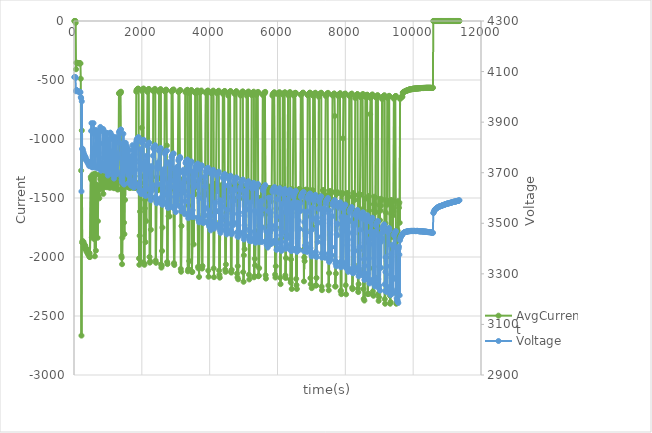
| Category | AvgCurrent |
|---|---|
| 10.017 | 0 |
| 20.016 | 0 |
| 30.027 | 0 |
| 40.04 | 0 |
| 50.044 | -16 |
| 60.05 | -409 |
| 70.051 | -353 |
| 80.059 | -355 |
| 90.064 | -355 |
| 100.068 | -356 |
| 110.075 | -355 |
| 120.085 | -357 |
| 130.099 | -357 |
| 140.11 | -358 |
| 150.125 | -357 |
| 160.14 | -358 |
| 170.144 | -358 |
| 180.146 | -358 |
| 190.158 | -360 |
| 200.16 | -489 |
| 210.163 | -1268 |
| 220.165 | -2666 |
| 230.172 | -928 |
| 240.173 | -1878 |
| 250.185 | -1864 |
| 260.198 | -1882 |
| 270.2 | -1885 |
| 280.215 | -1871 |
| 290.224 | -1915 |
| 300.235 | -1890 |
| 310.247 | -1897 |
| 320.252 | -1927 |
| 330.264 | -1904 |
| 340.28 | -1937 |
| 350.291 | -1934 |
| 360.341 | -1926 |
| 370.317 | -1955 |
| 380.371 | -1938 |
| 390.324 | -1951 |
| 400.357 | -1969 |
| 410.344 | -1946 |
| 420.403 | -1980 |
| 430.361 | -1963 |
| 440.449 | -1963 |
| 450.368 | -1998 |
| 460.466 | -1969 |
| 470.378 | -2001 |
| 495.441 | -1321 |
| 505.019 | -1339 |
| 515.442 | -1341 |
| 525.031 | -1834 |
| 535.54 | -1349 |
| 545.044 | -1301 |
| 555.615 | -1314 |
| 565.059 | -1406 |
| 575.64 | -1438 |
| 585.064 | -1391 |
| 595.638 | -1849 |
| 605.093 | -1294 |
| 615.667 | -1994 |
| 625.121 | -1311 |
| 635.792 | -1297 |
| 645.14 | -1946 |
| 655.758 | -1402 |
| 665.156 | -1386 |
| 675.81 | -1393 |
| 685.18 | -1395 |
| 695.843 | -1837 |
| 705.203 | -1696 |
| 715.944 | -1403 |
| 725.214 | -1488 |
| 735.967 | -1403 |
| 745.235 | -1503 |
| 755.951 | -1303 |
| 765.255 | -1305 |
| 776.014 | -1342 |
| 785.271 | -1330 |
| 796.061 | -1396 |
| 805.285 | -1306 |
| 816.098 | -1427 |
| 825.312 | -1366 |
| 836.162 | -1358 |
| 845.323 | -1309 |
| 856.166 | -1358 |
| 865.339 | -1465 |
| 876.263 | -1380 |
| 885.356 | -1404 |
| 896.34 | -1402 |
| 905.374 | -1309 |
| 916.323 | -1408 |
| 925.382 | -1303 |
| 936.388 | -1375 |
| 945.405 | -1341 |
| 956.452 | -1310 |
| 965.426 | -1315 |
| 976.5 | -1409 |
| 985.443 | -1319 |
| 996.559 | -1385 |
| 1005.459 | -1348 |
| 1016.667 | -1318 |
| 1025.48 | -1309 |
| 1036.616 | -1314 |
| 1045.496 | -1413 |
| 1056.575 | -1409 |
| 1065.514 | -1345 |
| 1076.638 | -1346 |
| 1085.527 | -1317 |
| 1096.682 | -1411 |
| 1105.551 | -1357 |
| 1116.699 | -1365 |
| 1125.577 | -1339 |
| 1136.738 | -1379 |
| 1145.588 | -1399 |
| 1156.798 | -1320 |
| 1165.602 | -1314 |
| 1176.794 | -1417 |
| 1185.617 | -1361 |
| 1196.876 | -1406 |
| 1205.626 | -1321 |
| 1216.903 | -1318 |
| 1225.639 | -1360 |
| 1236.967 | -1410 |
| 1245.665 | -1342 |
| 1256.998 | -1324 |
| 1265.672 | -1384 |
| 1277.018 | -1427 |
| 1285.7 | -1321 |
| 1297.073 | -1326 |
| 1305.728 | -1427 |
| 1317.105 | -1006 |
| 1325.74 | -614 |
| 1337.122 | -611 |
| 1345.752 | -606 |
| 1357.139 | -614 |
| 1365.777 | -605 |
| 1377.199 | -610 |
| 1385.79 | -599 |
| 1397.201 | -1991 |
| 1405.806 | -2006 |
| 1417.266 | -2061 |
| 1425.824 | -1837 |
| 1437.277 | -1313 |
| 1445.839 | -1418 |
| 1455.843 | -1291 |
| 1465.844 | -1395 |
| 1475.847 | -1709 |
| 1485.85 | -1806 |
| 1495.854 | -1373 |
| 1505.858 | -1516 |
| 1515.87 | -1303 |
| 1525.884 | -1345 |
| 1535.889 | -1298 |
| 1545.894 | -1384 |
| 1555.907 | -1401 |
| 1565.92 | -1301 |
| 1575.932 | -1304 |
| 1585.932 | -1408 |
| 1595.941 | -1373 |
| 1605.952 | -1306 |
| 1615.966 | -1408 |
| 1625.979 | -1407 |
| 1635.986 | -1392 |
| 1645.998 | -1416 |
| 1656.004 | -1365 |
| 1666.011 | -1304 |
| 1676.021 | -1407 |
| 1686.022 | -1333 |
| 1696.029 | -1411 |
| 1706.029 | -1403 |
| 1716.042 | -1309 |
| 1726.048 | -1330 |
| 1736.049 | -1402 |
| 1746.052 | -1414 |
| 1756.055 | -1380 |
| 1766.067 | -1315 |
| 1776.08 | -1315 |
| 1786.091 | -1315 |
| 1796.094 | -1361 |
| 1806.096 | -1414 |
| 1816.106 | -1414 |
| 1826.121 | -1372 |
| 1836.121 | -599 |
| 1846.123 | -586 |
| 1856.126 | -588 |
| 1866.137 | -578 |
| 1876.152 | -581 |
| 1886.159 | -574 |
| 1896.173 | -574 |
| 1906.202 | -576 |
| 1916.183 | -2012 |
| 1926.222 | -2066 |
| 1936.201 | -1820 |
| 1946.233 | -1615 |
| 1956.212 | -1411 |
| 1966.264 | -1373 |
| 1976.231 | -2042 |
| 1986.311 | -1316 |
| 1996.247 | -905 |
| 2006.357 | -595 |
| 2016.253 | -583 |
| 2026.42 | -578 |
| 2036.273 | -581 |
| 2046.465 | -573 |
| 2056.298 | -574 |
| 2066.514 | -2052 |
| 2076.313 | -2066 |
| 2086.592 | -1587 |
| 2096.335 | -1516 |
| 2106.608 | -1874 |
| 2116.353 | -1318 |
| 2126.575 | -1696 |
| 2136.378 | -1455 |
| 2146.672 | -1322 |
| 2156.397 | -1319 |
| 2166.687 | -601 |
| 2176.412 | -586 |
| 2186.733 | -587 |
| 2196.43 | -579 |
| 2206.83 | -576 |
| 2216.441 | -580 |
| 2226.859 | -1999 |
| 2236.454 | -2048 |
| 2246.89 | -2036 |
| 2256.462 | -1318 |
| 2266.873 | -1769 |
| 2276.481 | -1321 |
| 2286.953 | -1389 |
| 2296.493 | -1496 |
| 2306.981 | -1323 |
| 2316.502 | -1421 |
| 2326.995 | -1389 |
| 2336.517 | -593 |
| 2347.092 | -596 |
| 2356.543 | -586 |
| 2367.062 | -583 |
| 2376.565 | -584 |
| 2387.168 | -575 |
| 2396.58 | -583 |
| 2407.17 | -2030 |
| 2416.585 | -2049 |
| 2427.184 | -1531 |
| 2436.607 | -1508 |
| 2447.247 | -1437 |
| 2456.632 | -1432 |
| 2467.264 | -1328 |
| 2476.645 | -1434 |
| 2487.309 | -1419 |
| 2496.665 | -1332 |
| 2507.373 | -602 |
| 2516.689 | -590 |
| 2527.388 | -597 |
| 2536.714 | -582 |
| 2547.451 | -586 |
| 2556.725 | -577 |
| 2567.498 | -2063 |
| 2576.743 | -2090 |
| 2587.528 | -2074 |
| 2596.769 | -1949 |
| 2607.574 | -1750 |
| 2616.787 | -1441 |
| 2627.65 | -1332 |
| 2636.808 | -1333 |
| 2647.698 | -1411 |
| 2656.822 | -1341 |
| 2667.683 | -1098 |
| 2676.841 | -597 |
| 2687.712 | -595 |
| 2696.852 | -587 |
| 2707.76 | -590 |
| 2716.857 | -581 |
| 2727.807 | -587 |
| 2736.873 | -1055 |
| 2747.825 | -2042 |
| 2756.889 | -2060 |
| 2767.87 | -1482 |
| 2776.895 | -1412 |
| 2787.901 | -1654 |
| 2796.909 | -1339 |
| 2807.933 | -1387 |
| 2816.922 | -1656 |
| 2827.947 | -1414 |
| 2836.93 | -1341 |
| 2848.012 | -1344 |
| 2856.945 | -1340 |
| 2868.043 | -1346 |
| 2876.956 | -598 |
| 2888.089 | -593 |
| 2896.974 | -590 |
| 2908.124 | -586 |
| 2916.991 | -584 |
| 2928.154 | -585 |
| 2937.007 | -580 |
| 2948.186 | -2051 |
| 2957.029 | -2068 |
| 2968.245 | -1426 |
| 2977.056 | -1424 |
| 2988.282 | -1442 |
| 2997.071 | -1556 |
| 3008.327 | -1455 |
| 3017.085 | -1449 |
| 3028.375 | -1350 |
| 3037.114 | -1418 |
| 3048.39 | -1466 |
| 3057.14 | -1347 |
| 3068.434 | -1350 |
| 3077.152 | -602 |
| 3088.465 | -600 |
| 3097.172 | -594 |
| 3108.498 | -593 |
| 3117.19 | -588 |
| 3128.512 | -587 |
| 3137.204 | -586 |
| 3148.529 | -2101 |
| 3157.217 | -2125 |
| 3168.608 | -1737 |
| 3177.233 | -1343 |
| 3188.671 | -1372 |
| 3197.242 | -1397 |
| 3207.242 | -1429 |
| 3217.247 | -1453 |
| 3227.261 | -1369 |
| 3237.262 | -1434 |
| 3247.275 | -1351 |
| 3257.289 | -1350 |
| 3267.297 | -1363 |
| 3277.298 | -1359 |
| 3287.308 | -605 |
| 3297.323 | -597 |
| 3307.326 | -594 |
| 3317.34 | -590 |
| 3327.343 | -587 |
| 3337.351 | -592 |
| 3347.352 | -583 |
| 3357.357 | -2121 |
| 3367.369 | -2104 |
| 3377.378 | -1564 |
| 3387.383 | -2105 |
| 3397.389 | -2034 |
| 3407.404 | -612 |
| 3417.407 | -600 |
| 3427.408 | -605 |
| 3437.421 | -592 |
| 3447.431 | -593 |
| 3457.436 | -586 |
| 3467.436 | -587 |
| 3477.45 | -2126 |
| 3487.453 | -2127 |
| 3497.469 | -1673 |
| 3507.47 | -1404 |
| 3517.487 | -1357 |
| 3527.493 | -1893 |
| 3537.504 | -1372 |
| 3547.519 | -1359 |
| 3557.532 | -1414 |
| 3567.545 | -1468 |
| 3577.555 | -610 |
| 3587.561 | -609 |
| 3597.571 | -598 |
| 3607.579 | -600 |
| 3617.588 | -593 |
| 3627.599 | -600 |
| 3637.604 | -588 |
| 3647.608 | -595 |
| 3657.614 | -2083 |
| 3667.614 | -2097 |
| 3677.624 | -1666 |
| 3687.635 | -2169 |
| 3697.675 | -1678 |
| 3707.649 | -606 |
| 3717.654 | -604 |
| 3727.669 | -600 |
| 3737.674 | -594 |
| 3747.68 | -599 |
| 3757.714 | -589 |
| 3767.704 | -1327 |
| 3777.778 | -2098 |
| 3787.725 | -2076 |
| 3797.797 | -1684 |
| 3807.744 | -1464 |
| 3817.825 | -1639 |
| 3827.759 | -1448 |
| 3837.873 | -1461 |
| 3847.771 | -1407 |
| 3857.916 | -1369 |
| 3867.789 | -1474 |
| 3877.947 | -1468 |
| 3887.805 | -606 |
| 3897.981 | -612 |
| 3907.823 | -599 |
| 3918.042 | -597 |
| 3927.851 | -594 |
| 3938.057 | -597 |
| 3947.869 | -589 |
| 3958.075 | -2115 |
| 3967.88 | -2167 |
| 3978.12 | -1473 |
| 3987.899 | -1434 |
| 3998.135 | -1692 |
| 4007.914 | -1403 |
| 4018.183 | -1625 |
| 4027.939 | -1527 |
| 4038.198 | -1423 |
| 4047.956 | -611 |
| 4058.231 | -609 |
| 4067.972 | -601 |
| 4078.264 | -605 |
| 4087.986 | -596 |
| 4098.296 | -599 |
| 4107.992 | -590 |
| 4118.344 | -2096 |
| 4128.008 | -2171 |
| 4138.385 | -1694 |
| 4148.038 | -1698 |
| 4158.418 | -1382 |
| 4168.049 | -1610 |
| 4178.434 | -1612 |
| 4188.059 | -1379 |
| 4198.479 | -1378 |
| 4208.064 | -611 |
| 4218.497 | -605 |
| 4228.082 | -603 |
| 4238.541 | -598 |
| 4248.095 | -597 |
| 4258.577 | -604 |
| 4268.112 | -591 |
| 4278.627 | -2115 |
| 4288.14 | -2150 |
| 4298.65 | -2175 |
| 4308.167 | -1752 |
| 4318.684 | -1626 |
| 4328.19 | -1486 |
| 4338.745 | -1432 |
| 4348.218 | -1491 |
| 4358.806 | -1395 |
| 4368.22 | -1450 |
| 4378.84 | -1384 |
| 4388.227 | -617 |
| 4398.823 | -607 |
| 4408.251 | -605 |
| 4418.853 | -602 |
| 4428.261 | -598 |
| 4438.884 | -596 |
| 4448.273 | -593 |
| 4458.935 | -2106 |
| 4468.292 | -2126 |
| 4478.982 | -2063 |
| 4488.307 | -1661 |
| 4499.029 | -1631 |
| 4508.308 | -1606 |
| 4519.073 | -1451 |
| 4528.323 | -1496 |
| 4539.105 | -1421 |
| 4548.338 | -633 |
| 4559.166 | -611 |
| 4568.355 | -608 |
| 4579.169 | -604 |
| 4588.376 | -603 |
| 4599.215 | -599 |
| 4608.38 | -596 |
| 4619.259 | -594 |
| 4628.381 | -2125 |
| 4639.277 | -2132 |
| 4648.386 | -2108 |
| 4659.322 | -1489 |
| 4668.398 | -1719 |
| 4679.341 | -1434 |
| 4688.421 | -1392 |
| 4699.402 | -1391 |
| 4708.432 | -1501 |
| 4719.419 | -1419 |
| 4728.46 | -614 |
| 4739.449 | -610 |
| 4748.485 | -620 |
| 4759.526 | -604 |
| 4768.492 | -604 |
| 4779.512 | -597 |
| 4788.498 | -595 |
| 4799.573 | -602 |
| 4808.505 | -2140 |
| 4819.575 | -2173 |
| 4828.519 | -2077 |
| 4839.62 | -2189 |
| 4848.538 | -1392 |
| 4859.667 | -1496 |
| 4868.55 | -1392 |
| 4879.699 | -1462 |
| 4888.56 | -1504 |
| 4899.716 | -1448 |
| 4908.585 | -631 |
| 4919.777 | -628 |
| 4928.598 | -620 |
| 4939.825 | -607 |
| 4948.616 | -611 |
| 4959.902 | -601 |
| 4968.626 | -599 |
| 4979.917 | -597 |
| 4988.641 | -2128 |
| 4999.902 | -2210 |
| 5008.653 | -1985 |
| 5020.045 | -1400 |
| 5028.659 | -1934 |
| 5040.074 | -1428 |
| 5048.675 | -1399 |
| 5060.107 | -1404 |
| 5068.691 | -1512 |
| 5078.703 | -1457 |
| 5088.713 | -632 |
| 5098.723 | -612 |
| 5108.724 | -616 |
| 5118.731 | -605 |
| 5128.733 | -605 |
| 5138.742 | -600 |
| 5148.753 | -598 |
| 5158.763 | -2150 |
| 5168.776 | -2190 |
| 5178.782 | -1840 |
| 5188.794 | -1848 |
| 5198.805 | -1404 |
| 5208.81 | -1484 |
| 5218.823 | -1519 |
| 5228.824 | -1403 |
| 5238.828 | -628 |
| 5248.836 | -616 |
| 5258.843 | -611 |
| 5268.856 | -617 |
| 5278.87 | -605 |
| 5288.871 | -616 |
| 5298.882 | -599 |
| 5308.896 | -2172 |
| 5318.905 | -2163 |
| 5328.907 | -2015 |
| 5338.912 | -2071 |
| 5348.919 | -1781 |
| 5358.926 | -1405 |
| 5368.94 | -623 |
| 5378.948 | -627 |
| 5388.949 | -612 |
| 5398.964 | -618 |
| 5408.972 | -606 |
| 5418.98 | -606 |
| 5428.991 | -601 |
| 5438.995 | -2163 |
| 5448.998 | -2159 |
| 5458.998 | -2094 |
| 5469.01 | -1733 |
| 5479.018 | -1737 |
| 5489.026 | -1503 |
| 5499.034 | -1498 |
| 5509.062 | -1737 |
| 5519.063 | -1404 |
| 5529.093 | -1409 |
| 5539.084 | -1414 |
| 5549.154 | -1412 |
| 5559.107 | -1631 |
| 5569.239 | -628 |
| 5579.136 | -622 |
| 5589.247 | -614 |
| 5599.147 | -615 |
| 5609.294 | -609 |
| 5619.164 | -615 |
| 5629.358 | -603 |
| 5639.168 | -601 |
| 5649.372 | -2154 |
| 5659.184 | -2183 |
| 5669.39 | -1491 |
| 5679.21 | -1632 |
| 5689.435 | -1411 |
| 5699.237 | -1489 |
| 5709.467 | -1585 |
| 5719.242 | -1576 |
| 5729.483 | -1527 |
| 5739.251 | -1477 |
| 5749.564 | -1524 |
| 5759.275 | -1416 |
| 5769.621 | -1438 |
| 5779.281 | -1442 |
| 5789.595 | -1417 |
| 5799.291 | -1528 |
| 5809.683 | -1437 |
| 5819.306 | -1451 |
| 5829.672 | -1416 |
| 5839.314 | -1421 |
| 5849.719 | -633 |
| 5859.332 | -619 |
| 5869.749 | -626 |
| 5879.351 | -615 |
| 5889.776 | -620 |
| 5899.381 | -606 |
| 5909.839 | -605 |
| 5919.384 | -609 |
| 5929.907 | -2149 |
| 5939.405 | -2174 |
| 5949.919 | -2078 |
| 5959.419 | -1854 |
| 5969.967 | -1589 |
| 5979.428 | -1415 |
| 5990.013 | -1682 |
| 5999.442 | -1444 |
| 6010.048 | -620 |
| 6019.461 | -616 |
| 6030.124 | -619 |
| 6039.471 | -609 |
| 6050.139 | -612 |
| 6059.485 | -603 |
| 6070.215 | -613 |
| 6079.501 | -2175 |
| 6090.245 | -2230 |
| 6099.519 | -1749 |
| 6110.294 | -1412 |
| 6119.53 | -1837 |
| 6130.343 | -1622 |
| 6139.54 | -1512 |
| 6150.328 | -1524 |
| 6159.555 | -624 |
| 6170.386 | -618 |
| 6179.574 | -614 |
| 6190.466 | -612 |
| 6199.591 | -609 |
| 6210.451 | -608 |
| 6219.598 | -604 |
| 6230.516 | -2155 |
| 6239.61 | -2178 |
| 6250.544 | -2009 |
| 6259.636 | -1494 |
| 6270.624 | -1440 |
| 6279.661 | -1814 |
| 6290.698 | -1474 |
| 6299.689 | -1507 |
| 6310.734 | -622 |
| 6319.699 | -631 |
| 6330.761 | -614 |
| 6339.719 | -616 |
| 6350.855 | -608 |
| 6359.722 | -606 |
| 6370.89 | -603 |
| 6379.745 | -2194 |
| 6390.949 | -2217 |
| 6399.765 | -2020 |
| 6411.001 | -1628 |
| 6419.779 | -2271 |
| 6431.076 | -1424 |
| 6439.792 | -1499 |
| 6451.048 | -1446 |
| 6459.806 | -1454 |
| 6471.137 | -631 |
| 6479.814 | -621 |
| 6491.153 | -627 |
| 6499.843 | -614 |
| 6511.203 | -623 |
| 6519.859 | -609 |
| 6531.265 | -609 |
| 6539.886 | -610 |
| 6551.311 | -2185 |
| 6559.894 | -2238 |
| 6571.28 | -2271 |
| 6579.912 | -1481 |
| 6591.342 | -1490 |
| 6599.933 | -1438 |
| 6611.386 | -1535 |
| 6619.942 | -1536 |
| 6629.952 | -1426 |
| 6639.96 | -1427 |
| 6649.975 | -1428 |
| 6659.989 | -1425 |
| 6669.991 | -1475 |
| 6679.999 | -1532 |
| 6690.006 | -628 |
| 6700.017 | -623 |
| 6710.027 | -618 |
| 6720.038 | -616 |
| 6730.052 | -613 |
| 6740.058 | -610 |
| 6750.071 | -610 |
| 6760.082 | -607 |
| 6770.094 | -1938 |
| 6780.1 | -2206 |
| 6790.102 | -2003 |
| 6800.11 | -2035 |
| 6810.118 | -1487 |
| 6820.118 | -1433 |
| 6830.126 | -1770 |
| 6840.13 | -1429 |
| 6850.131 | -1544 |
| 6860.141 | -1656 |
| 6870.154 | -1517 |
| 6880.167 | -1430 |
| 6890.17 | -629 |
| 6900.182 | -629 |
| 6910.194 | -625 |
| 6920.208 | -616 |
| 6930.216 | -617 |
| 6940.23 | -611 |
| 6950.233 | -609 |
| 6960.239 | -607 |
| 6970.243 | -2179 |
| 6980.249 | -2230 |
| 6990.254 | -1444 |
| 7000.269 | -1659 |
| 7010.271 | -2264 |
| 7020.28 | -1436 |
| 7030.28 | -1744 |
| 7040.287 | -1434 |
| 7050.295 | -632 |
| 7060.302 | -635 |
| 7070.317 | -620 |
| 7080.33 | -617 |
| 7090.33 | -614 |
| 7100.361 | -616 |
| 7110.345 | -615 |
| 7120.357 | -608 |
| 7130.371 | -2242 |
| 7140.379 | -2240 |
| 7150.385 | -2177 |
| 7160.398 | -1542 |
| 7170.408 | -1529 |
| 7180.411 | -1528 |
| 7190.415 | -1551 |
| 7200.469 | -1483 |
| 7210.429 | -1505 |
| 7220.481 | -643 |
| 7230.454 | -626 |
| 7240.543 | -622 |
| 7250.48 | -619 |
| 7260.527 | -618 |
| 7270.497 | -613 |
| 7280.591 | -611 |
| 7290.512 | -608 |
| 7300.656 | -2251 |
| 7310.54 | -2281 |
| 7320.731 | -1542 |
| 7330.558 | -1523 |
| 7340.732 | -1434 |
| 7350.567 | -1435 |
| 7360.798 | -1464 |
| 7370.587 | -1436 |
| 7380.799 | -1469 |
| 7390.598 | -1506 |
| 7400.887 | -1476 |
| 7410.601 | -1481 |
| 7420.874 | -635 |
| 7430.621 | -628 |
| 7440.966 | -629 |
| 7450.649 | -619 |
| 7460.951 | -627 |
| 7470.663 | -614 |
| 7481.016 | -616 |
| 7490.668 | -609 |
| 7501.03 | -2242 |
| 7510.691 | -2282 |
| 7521.078 | -2136 |
| 7530.712 | -1465 |
| 7541.123 | -1441 |
| 7550.728 | -1480 |
| 7561.17 | -1552 |
| 7570.744 | -1450 |
| 7581.186 | -1444 |
| 7590.768 | -1447 |
| 7601.263 | -1512 |
| 7610.783 | -1451 |
| 7621.343 | -631 |
| 7630.796 | -628 |
| 7641.372 | -631 |
| 7650.811 | -620 |
| 7661.39 | -623 |
| 7670.835 | -614 |
| 7681.438 | -617 |
| 7690.85 | -805 |
| 7701.454 | -2249 |
| 7710.87 | -2250 |
| 7721.498 | -2140 |
| 7730.885 | -1593 |
| 7741.545 | -1467 |
| 7750.908 | -1459 |
| 7761.575 | -1453 |
| 7770.937 | -1453 |
| 7781.622 | -634 |
| 7790.96 | -629 |
| 7801.673 | -624 |
| 7810.975 | -623 |
| 7821.746 | -619 |
| 7830.989 | -617 |
| 7841.81 | -615 |
| 7851.01 | -612 |
| 7861.81 | -2291 |
| 7871.031 | -2285 |
| 7881.889 | -2315 |
| 7891.047 | -1461 |
| 7901.889 | -1471 |
| 7911.058 | -1546 |
| 7921.938 | -1458 |
| 7931.076 | -994 |
| 7941.987 | -634 |
| 7951.079 | -628 |
| 7962.044 | -626 |
| 7971.097 | -623 |
| 7982.09 | -619 |
| 7991.118 | -617 |
| 8002.137 | -615 |
| 8011.142 | -2239 |
| 8022.185 | -2316 |
| 8031.153 | -1570 |
| 8042.214 | -1551 |
| 8051.156 | -1458 |
| 8062.295 | -1557 |
| 8071.18 | -1580 |
| 8082.28 | -1706 |
| 8091.193 | -1586 |
| 8102.37 | -1488 |
| 8111.209 | -1601 |
| 8122.373 | -637 |
| 8131.235 | -633 |
| 8142.42 | -629 |
| 8151.258 | -625 |
| 8162.467 | -622 |
| 8171.271 | -620 |
| 8182.531 | -620 |
| 8191.283 | -615 |
| 8202.543 | -2260 |
| 8211.309 | -2273 |
| 8222.607 | -2098 |
| 8231.317 | -1458 |
| 8242.61 | -1945 |
| 8251.335 | -2063 |
| 8262.67 | -1473 |
| 8271.352 | -1517 |
| 8282.72 | -1476 |
| 8291.378 | -654 |
| 8302.73 | -639 |
| 8311.385 | -638 |
| 8322.778 | -629 |
| 8331.403 | -635 |
| 8342.843 | -623 |
| 8351.43 | -621 |
| 8361.436 | -620 |
| 8371.439 | -2268 |
| 8381.447 | -2297 |
| 8391.449 | -2230 |
| 8401.46 | -1943 |
| 8411.462 | -1468 |
| 8421.471 | -1590 |
| 8431.485 | -1472 |
| 8441.497 | -1473 |
| 8451.502 | -647 |
| 8461.505 | -637 |
| 8471.52 | -640 |
| 8481.528 | -631 |
| 8491.542 | -640 |
| 8501.552 | -623 |
| 8511.564 | -627 |
| 8521.577 | -619 |
| 8531.581 | -2271 |
| 8541.596 | -2355 |
| 8551.603 | -1686 |
| 8561.608 | -2369 |
| 8571.613 | -1878 |
| 8581.617 | -1508 |
| 8591.63 | -643 |
| 8601.643 | -637 |
| 8611.645 | -633 |
| 8621.647 | -630 |
| 8631.654 | -628 |
| 8641.659 | -625 |
| 8651.674 | -626 |
| 8661.685 | -2314 |
| 8671.695 | -2313 |
| 8681.696 | -2312 |
| 8691.708 | -1483 |
| 8701.711 | -1607 |
| 8711.712 | -1706 |
| 8721.72 | -2095 |
| 8731.731 | -790 |
| 8741.74 | -653 |
| 8751.752 | -637 |
| 8761.757 | -645 |
| 8771.77 | -631 |
| 8781.77 | -630 |
| 8791.784 | -625 |
| 8801.788 | -623 |
| 8811.793 | -2291 |
| 8821.795 | -2324 |
| 8831.823 | -2328 |
| 8841.817 | -1553 |
| 8851.906 | -1489 |
| 8861.832 | -1549 |
| 8871.904 | -2172 |
| 8881.853 | -1496 |
| 8891.952 | -1620 |
| 8901.862 | -649 |
| 8912.029 | -643 |
| 8921.885 | -643 |
| 8932.06 | -636 |
| 8941.904 | -634 |
| 8952.061 | -628 |
| 8961.932 | -634 |
| 8972.185 | -2312 |
| 8981.933 | -2372 |
| 8992.203 | -2340 |
| 9001.947 | -2082 |
| 9012.168 | -1562 |
| 9021.975 | -1688 |
| 9032.31 | -1507 |
| 9041.986 | -1606 |
| 9052.265 | -1564 |
| 9062.009 | -1523 |
| 9072.39 | -1511 |
| 9082.022 | -661 |
| 9092.405 | -647 |
| 9102.035 | -657 |
| 9112.423 | -641 |
| 9122.058 | -649 |
| 9132.432 | -634 |
| 9142.087 | -642 |
| 9152.512 | -629 |
| 9162.093 | -2357 |
| 9172.528 | -2396 |
| 9182.115 | -1714 |
| 9192.622 | -1624 |
| 9202.132 | -2003 |
| 9212.653 | -1542 |
| 9222.149 | -1517 |
| 9232.669 | -1557 |
| 9242.167 | -652 |
| 9252.732 | -646 |
| 9262.188 | -642 |
| 9272.764 | -647 |
| 9282.206 | -638 |
| 9292.792 | -634 |
| 9302.223 | -639 |
| 9312.829 | -2326 |
| 9322.238 | -2396 |
| 9332.906 | -2382 |
| 9342.251 | -1518 |
| 9352.921 | -1636 |
| 9362.265 | -1518 |
| 9372.935 | -1581 |
| 9382.281 | -1530 |
| 9393.013 | -1832 |
| 9402.289 | -1648 |
| 9413.03 | -1525 |
| 9422.318 | -1613 |
| 9433.029 | -660 |
| 9442.326 | -650 |
| 9453.092 | -645 |
| 9462.354 | -644 |
| 9473.107 | -639 |
| 9482.376 | -637 |
| 9493.198 | -635 |
| 9502.399 | -2396 |
| 9513.17 | -2379 |
| 9522.419 | -1769 |
| 9533.248 | -1864 |
| 9542.445 | -1778 |
| 9553.247 | -1527 |
| 9562.458 | -1851 |
| 9573.31 | -1556 |
| 9582.477 | -1583 |
| 9593.309 | -1538 |
| 9602.49 | -1710 |
| 9613.387 | -661 |
| 9622.496 | -653 |
| 9633.419 | -652 |
| 9642.503 | -647 |
| 9653.45 | -643 |
| 9662.521 | -647 |
| 9673.483 | -637 |
| 9682.54 | -642 |
| 9693.512 | -607 |
| 9702.56 | -605 |
| 9713.53 | -602 |
| 9722.579 | -603 |
| 9733.638 | -601 |
| 9742.584 | -598 |
| 9753.609 | -597 |
| 9762.596 | -596 |
| 9773.7 | -594 |
| 9782.607 | -593 |
| 9793.747 | -591 |
| 9802.615 | -590 |
| 9813.716 | -589 |
| 9822.637 | -588 |
| 9833.842 | -588 |
| 9842.659 | -587 |
| 9853.826 | -585 |
| 9862.679 | -583 |
| 9873.841 | -583 |
| 9882.69 | -581 |
| 9893.901 | -581 |
| 9902.697 | -580 |
| 9913.931 | -579 |
| 9922.71 | -579 |
| 9933.966 | -578 |
| 9942.738 | -577 |
| 9953.998 | -578 |
| 9962.746 | -579 |
| 9974.076 | -576 |
| 9982.764 | -575 |
| 9994.103 | -574 |
| 10002.783 | -574 |
| 10014.091 | -574 |
| 10022.812 | -574 |
| 10034.153 | -574 |
| 10042.826 | -573 |
| 10054.167 | -573 |
| 10062.852 | -572 |
| 10074.216 | -572 |
| 10082.881 | -573 |
| 10094.244 | -572 |
| 10102.889 | -571 |
| 10114.293 | -571 |
| 10122.894 | -571 |
| 10132.897 | -573 |
| 10142.908 | -571 |
| 10152.909 | -570 |
| 10162.91 | -570 |
| 10172.91 | -570 |
| 10182.924 | -569 |
| 10192.934 | -571 |
| 10202.936 | -569 |
| 10212.939 | -569 |
| 10222.943 | -569 |
| 10232.956 | -568 |
| 10242.957 | -568 |
| 10252.96 | -568 |
| 10262.966 | -568 |
| 10272.974 | -568 |
| 10282.982 | -567 |
| 10292.987 | -569 |
| 10302.994 | -567 |
| 10313.005 | -567 |
| 10323.02 | -568 |
| 10333.025 | -567 |
| 10343.027 | -567 |
| 10353.038 | -566 |
| 10363.039 | -567 |
| 10373.052 | -567 |
| 10383.066 | -566 |
| 10393.078 | -566 |
| 10403.093 | -566 |
| 10413.108 | -566 |
| 10423.115 | -566 |
| 10433.119 | -566 |
| 10443.13 | -566 |
| 10453.135 | -566 |
| 10463.135 | -566 |
| 10473.138 | -566 |
| 10483.151 | -566 |
| 10493.166 | -566 |
| 10503.169 | -566 |
| 10513.171 | -566 |
| 10523.176 | -566 |
| 10533.187 | -567 |
| 10543.2 | -567 |
| 10553.192 | -567 |
| 10563.228 | -567 |
| 10573.208 | -566 |
| 10583.262 | -566 |
| 10593.231 | 0 |
| 10603.356 | 0 |
| 10613.253 | 0 |
| 10623.37 | 0 |
| 10633.271 | 0 |
| 10643.384 | 0 |
| 10653.29 | 0 |
| 10663.419 | 0 |
| 10673.305 | 0 |
| 10683.479 | 0 |
| 10693.329 | 0 |
| 10703.526 | 0 |
| 10713.345 | 0 |
| 10723.575 | 0 |
| 10733.36 | 0 |
| 10743.623 | 0 |
| 10753.384 | 0 |
| 10763.655 | 0 |
| 10773.395 | 0 |
| 10783.716 | 0 |
| 10793.419 | 0 |
| 10803.744 | 0 |
| 10813.439 | 0 |
| 10823.824 | 0 |
| 10833.454 | 0 |
| 10843.825 | 0 |
| 10853.469 | 0 |
| 10863.918 | 0 |
| 10873.476 | 0 |
| 10883.935 | 0 |
| 10893.502 | 0 |
| 10903.994 | 0 |
| 10913.52 | 0 |
| 10924.012 | 0 |
| 10933.545 | 0 |
| 10944.043 | 0 |
| 10953.564 | 0 |
| 10964.121 | 0 |
| 10973.585 | 0 |
| 10984.168 | 0 |
| 10993.599 | 0 |
| 11004.152 | 0 |
| 11013.605 | 0 |
| 11024.196 | 0 |
| 11033.624 | 0 |
| 11044.23 | 0 |
| 11053.636 | 0 |
| 11064.308 | 0 |
| 11073.637 | 0 |
| 11084.389 | 0 |
| 11093.665 | 0 |
| 11104.416 | 0 |
| 11113.692 | 0 |
| 11124.435 | 0 |
| 11133.703 | 0 |
| 11144.494 | 0 |
| 11153.72 | 0 |
| 11164.558 | 0 |
| 11173.746 | 0 |
| 11184.592 | 0 |
| 11193.765 | 0 |
| 11204.62 | 0 |
| 11213.781 | 0 |
| 11224.67 | 0 |
| 11233.783 | 0 |
| 11244.682 | 0 |
| 11253.805 | 0 |
| 11264.778 | 0 |
| 11273.827 | 0 |
| 11284.744 | 0 |
| 11293.851 | 0 |
| 11304.792 | 0 |
| 11313.865 | 0 |
| 11324.837 | 0 |
| 11333.892 | 0 |
| 11344.968 | 0 |
| 11353.922 | 0 |
| 11364.934 | 0 |